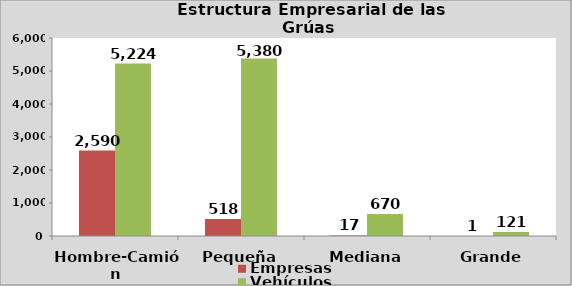
| Category | Empresas | Vehículos |
|---|---|---|
| Hombre-Camión | 2590 | 5224 |
| Pequeña | 518 | 5380 |
| Mediana | 17 | 670 |
| Grande | 1 | 121 |